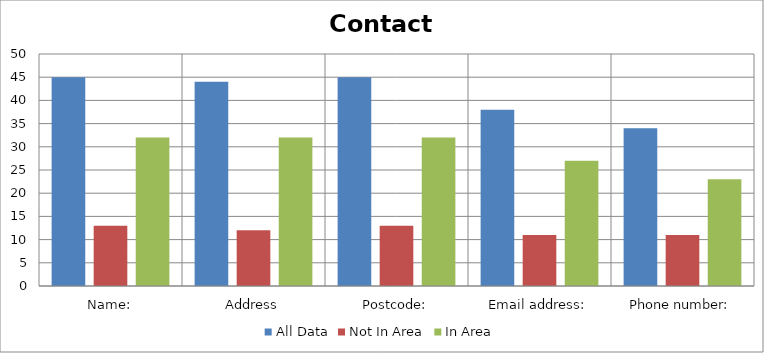
| Category | All Data | Not In Area | In Area |
|---|---|---|---|
| Name: | 45 | 13 | 32 |
| Address | 44 | 12 | 32 |
| Postcode: | 45 | 13 | 32 |
| Email address: | 38 | 11 | 27 |
| Phone number: | 34 | 11 | 23 |